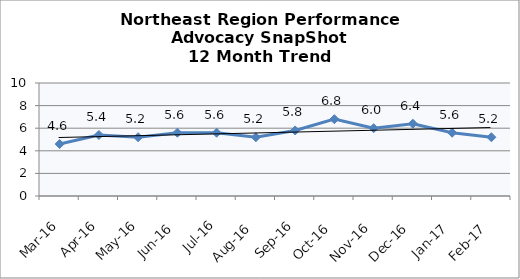
| Category | Northeast Region |
|---|---|
| Mar-16 | 4.6 |
| Apr-16 | 5.4 |
| May-16 | 5.2 |
| Jun-16 | 5.6 |
| Jul-16 | 5.6 |
| Aug-16 | 5.2 |
| Sep-16 | 5.8 |
| Oct-16 | 6.8 |
| Nov-16 | 6 |
| Dec-16 | 6.4 |
| Jan-17 | 5.6 |
| Feb-17 | 5.2 |